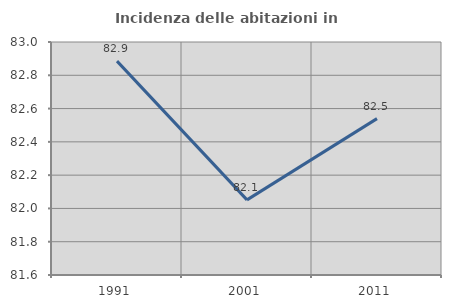
| Category | Incidenza delle abitazioni in proprietà  |
|---|---|
| 1991.0 | 82.885 |
| 2001.0 | 82.051 |
| 2011.0 | 82.54 |